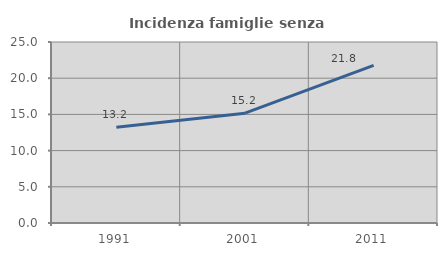
| Category | Incidenza famiglie senza nuclei |
|---|---|
| 1991.0 | 13.232 |
| 2001.0 | 15.175 |
| 2011.0 | 21.769 |